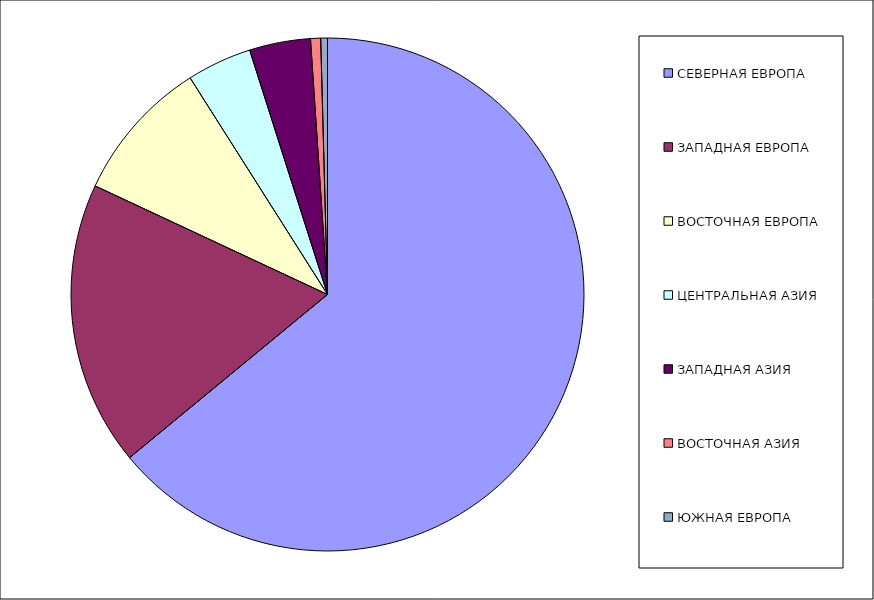
| Category | Оборот |
|---|---|
| СЕВЕРНАЯ ЕВРОПА | 64.025 |
| ЗАПАДНАЯ ЕВРОПА | 17.934 |
| ВОСТОЧНАЯ ЕВРОПА | 9.046 |
| ЦЕНТРАЛЬНАЯ АЗИЯ | 4.089 |
| ЗАПАДНАЯ АЗИЯ | 3.848 |
| ВОСТОЧНАЯ АЗИЯ | 0.636 |
| ЮЖНАЯ ЕВРОПА | 0.423 |